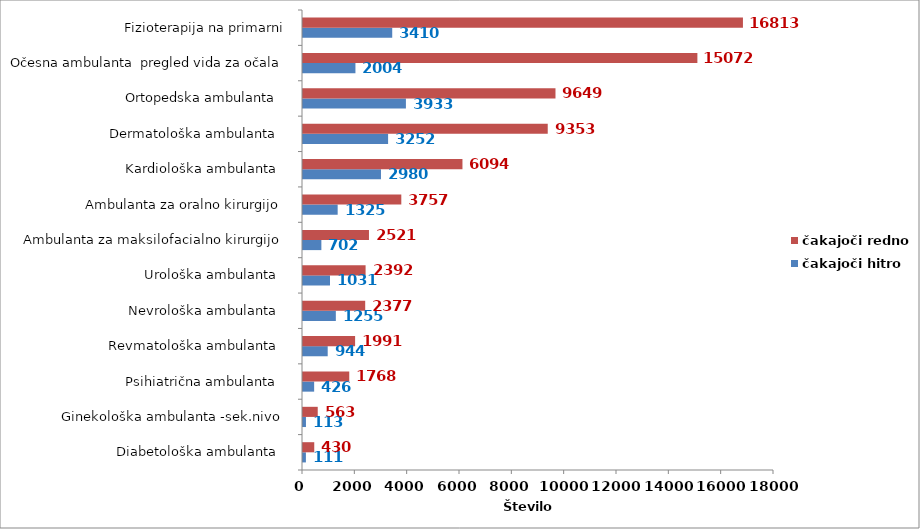
| Category | čakajoči hitro | čakajoči redno |
|---|---|---|
| Diabetološka ambulanta   | 111 | 430 |
| Ginekološka ambulanta -sek.nivo  | 113 | 563 |
| Psihiatrična ambulanta   | 426 | 1768 |
| Revmatološka ambulanta   | 944 | 1991 |
| Nevrološka ambulanta   | 1255 | 2377 |
| Urološka ambulanta   | 1031 | 2392 |
| Ambulanta za maksilofacialno kirurgijo  | 702 | 2521 |
| Ambulanta za oralno kirurgijo  | 1325 | 3757 |
| Kardiološka ambulanta   | 2980 | 6094 |
| Dermatološka ambulanta   | 3252 | 9353 |
| Ortopedska ambulanta   | 3933 | 9649 |
| Očesna ambulanta  pregled vida za očala | 2004 | 15072 |
| Fizioterapija na primarni | 3410 | 16813 |